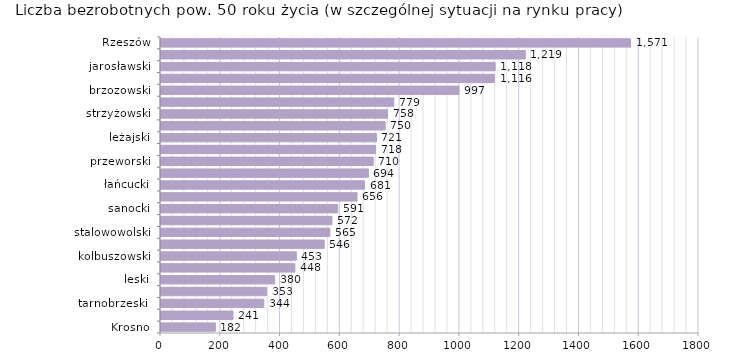
| Category | Liczba bezrobotnych powyżej 50 roku życia - w szczególnej sytuacji na rynku pracy |
|---|---|
| Krosno | 182 |
| bieszczadzki | 241 |
| tarnobrzeski  | 344 |
| Tarnobrzeg | 353 |
| leski | 380 |
| lubaczowski | 448 |
| kolbuszowski | 453 |
| krośnieński | 546 |
| stalowowolski | 565 |
| dębicki | 572 |
| sanocki | 591 |
| ropczycko-sędziszowski | 656 |
| łańcucki | 681 |
| mielecki | 694 |
| przeworski | 710 |
| przemyski | 718 |
| leżajski | 721 |
| Przemyśl | 750 |
| strzyżowski | 758 |
| niżański | 779 |
| brzozowski | 997 |
| jasielski | 1116 |
| jarosławski | 1118 |
| rzeszowski | 1219 |
| Rzeszów | 1571 |